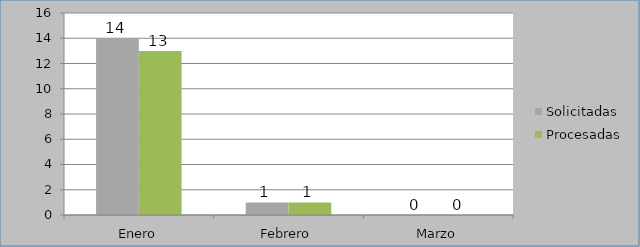
| Category | Solicitadas | Procesadas |
|---|---|---|
| Enero | 14 | 13 |
| Febrero | 1 | 1 |
| Marzo | 0 | 0 |